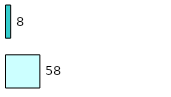
| Category | Series 0 | Series 1 |
|---|---|---|
| 0 | 58 | 8 |